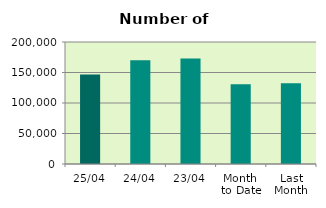
| Category | Series 0 |
|---|---|
| 25/04 | 146750 |
| 24/04 | 170056 |
| 23/04 | 173094 |
| Month 
to Date | 130911.765 |
| Last
Month | 132498.571 |